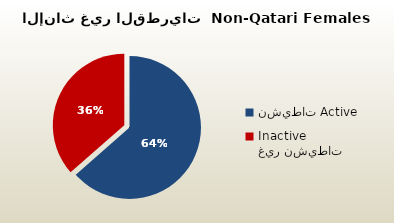
| Category | الاناث غير القطريات  Non-Qatari Females |
|---|---|
| نشيطات Active | 262939 |
| غير نشيطات Inactive | 150914 |